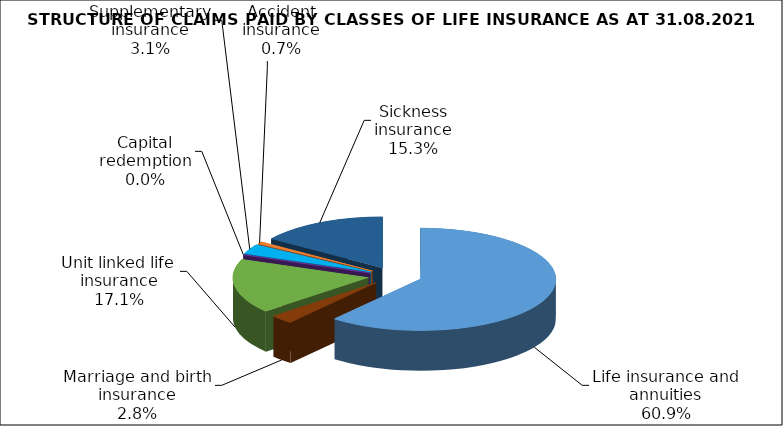
| Category | Series 0 |
|---|---|
| Life insurance and annuities | 89209408.989 |
| Marriage and birth insurance | 4081051.299 |
| Unit linked life insurance | 25123337.153 |
| Capital redemption | 0 |
| Supplementary insurance | 4592753.626 |
| Accident insurance | 1050465.367 |
| Sickness insurance | 22465636.299 |